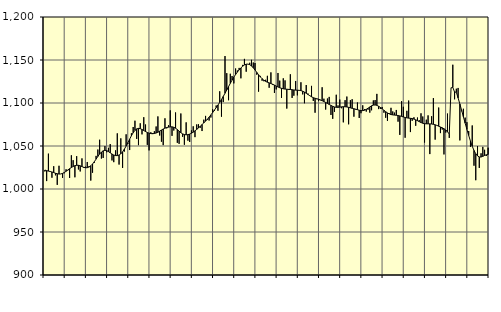
| Category | Piggar | Series 1 |
|---|---|---|
| nan | 1020.4 | 1022.06 |
| 1.0 | 1009.2 | 1021.32 |
| 1.0 | 1041.1 | 1020.83 |
| 1.0 | 1020.2 | 1020.38 |
| 1.0 | 1013.1 | 1019.77 |
| 1.0 | 1026.5 | 1019.11 |
| 1.0 | 1015.9 | 1018.29 |
| 1.0 | 1004.8 | 1017.75 |
| 1.0 | 1027 | 1017.39 |
| 1.0 | 1017.5 | 1017.51 |
| 1.0 | 1012.9 | 1018.12 |
| 1.0 | 1018.3 | 1019.17 |
| nan | 1022.9 | 1020.57 |
| 2.0 | 1021.6 | 1022.12 |
| 2.0 | 1012.8 | 1023.63 |
| 2.0 | 1039.2 | 1024.98 |
| 2.0 | 1033.5 | 1026.19 |
| 2.0 | 1013.6 | 1027.11 |
| 2.0 | 1038.2 | 1027.57 |
| 2.0 | 1022.7 | 1027.54 |
| 2.0 | 1020.4 | 1026.97 |
| 2.0 | 1035.6 | 1026.07 |
| 2.0 | 1024.5 | 1025.22 |
| 2.0 | 1026 | 1024.72 |
| nan | 1031.4 | 1024.78 |
| 3.0 | 1026.6 | 1025.52 |
| 3.0 | 1009.8 | 1026.97 |
| 3.0 | 1018.9 | 1029.09 |
| 3.0 | 1030.4 | 1031.74 |
| 3.0 | 1038.5 | 1034.75 |
| 3.0 | 1045.9 | 1037.85 |
| 3.0 | 1057.3 | 1040.69 |
| 3.0 | 1035.4 | 1042.93 |
| 3.0 | 1036.1 | 1044.4 |
| 3.0 | 1049.9 | 1044.96 |
| 3.0 | 1042.7 | 1044.61 |
| nan | 1047.9 | 1043.51 |
| 4.0 | 1052.2 | 1042.06 |
| 4.0 | 1033.2 | 1040.64 |
| 4.0 | 1031.2 | 1039.55 |
| 4.0 | 1044.9 | 1038.87 |
| 4.0 | 1064.7 | 1038.8 |
| 4.0 | 1028.4 | 1039.47 |
| 4.0 | 1058.9 | 1040.91 |
| 4.0 | 1024.5 | 1043.22 |
| 4.0 | 1043.5 | 1046.31 |
| 4.0 | 1063.6 | 1049.93 |
| 4.0 | 1052.3 | 1053.86 |
| nan | 1045.3 | 1057.98 |
| 5.0 | 1064.8 | 1061.93 |
| 5.0 | 1072.1 | 1065.41 |
| 5.0 | 1079.4 | 1068.15 |
| 5.0 | 1058.2 | 1069.9 |
| 5.0 | 1051 | 1070.49 |
| 5.0 | 1076.4 | 1070.14 |
| 5.0 | 1063.5 | 1069.18 |
| 5.0 | 1083.5 | 1067.98 |
| 5.0 | 1075 | 1066.82 |
| 5.0 | 1051.3 | 1065.77 |
| 5.0 | 1044.9 | 1064.94 |
| nan | 1066 | 1064.41 |
| 6.0 | 1065.1 | 1064.29 |
| 6.0 | 1067.2 | 1064.55 |
| 6.0 | 1072.7 | 1065.09 |
| 6.0 | 1084.4 | 1065.98 |
| 6.0 | 1062.2 | 1067.25 |
| 6.0 | 1055 | 1068.56 |
| 6.0 | 1051 | 1069.75 |
| 6.0 | 1082.2 | 1070.77 |
| 6.0 | 1070.5 | 1071.48 |
| 6.0 | 1074.2 | 1071.95 |
| 6.0 | 1091.4 | 1072.27 |
| nan | 1061.8 | 1072.28 |
| 7.0 | 1068 | 1071.75 |
| 7.0 | 1089 | 1070.7 |
| 7.0 | 1053.7 | 1069.16 |
| 7.0 | 1052.5 | 1067.31 |
| 7.0 | 1087.8 | 1065.48 |
| 7.0 | 1060.7 | 1064.09 |
| 7.0 | 1051.4 | 1063.3 |
| 7.0 | 1077.5 | 1063.04 |
| 7.0 | 1056.2 | 1063.22 |
| 7.0 | 1054.7 | 1063.84 |
| 7.0 | 1068.2 | 1064.83 |
| nan | 1072.9 | 1066.09 |
| 8.0 | 1060.3 | 1067.63 |
| 8.0 | 1075.1 | 1069.3 |
| 8.0 | 1075.2 | 1071.08 |
| 8.0 | 1071.2 | 1072.98 |
| 8.0 | 1067.4 | 1074.9 |
| 8.0 | 1080.6 | 1076.84 |
| 8.0 | 1085 | 1078.91 |
| 8.0 | 1080.2 | 1081.12 |
| 8.0 | 1079.6 | 1083.54 |
| 8.0 | 1083.1 | 1086.17 |
| 8.0 | 1092.7 | 1088.92 |
| nan | 1090.7 | 1091.75 |
| 9.0 | 1097.1 | 1094.65 |
| 9.0 | 1091 | 1097.65 |
| 9.0 | 1113.6 | 1100.73 |
| 9.0 | 1084.1 | 1104.05 |
| 9.0 | 1101.1 | 1107.62 |
| 9.0 | 1154.6 | 1111.34 |
| 9.0 | 1134.7 | 1115.16 |
| 9.0 | 1103.2 | 1119.02 |
| 9.0 | 1134 | 1122.87 |
| 9.0 | 1131.4 | 1126.59 |
| 9.0 | 1122.8 | 1130.04 |
| nan | 1140.1 | 1133.14 |
| 10.0 | 1137.8 | 1135.93 |
| 10.0 | 1140.8 | 1138.5 |
| 10.0 | 1128.7 | 1140.82 |
| 10.0 | 1144.3 | 1142.76 |
| 10.0 | 1151.3 | 1144.25 |
| 10.0 | 1136.4 | 1145.13 |
| 10.0 | 1145.3 | 1145.23 |
| 10.0 | 1146.8 | 1144.57 |
| 10.0 | 1150.2 | 1143.13 |
| 10.0 | 1147.1 | 1140.95 |
| 10.0 | 1146.5 | 1138.34 |
| nan | 1132.9 | 1135.58 |
| 11.0 | 1113.2 | 1132.86 |
| 11.0 | 1131.5 | 1130.35 |
| 11.0 | 1125.9 | 1128.26 |
| 11.0 | 1125.3 | 1126.58 |
| 11.0 | 1127 | 1125.19 |
| 11.0 | 1131.6 | 1124.16 |
| 11.0 | 1117.7 | 1123.41 |
| 11.0 | 1135.6 | 1122.65 |
| 11.0 | 1120.9 | 1121.78 |
| 11.0 | 1111.7 | 1120.8 |
| 11.0 | 1115.8 | 1119.69 |
| nan | 1134.9 | 1118.62 |
| 12.0 | 1126 | 1117.73 |
| 12.0 | 1105.9 | 1117.05 |
| 12.0 | 1128.7 | 1116.51 |
| 12.0 | 1126.3 | 1116.2 |
| 12.0 | 1093.5 | 1116.01 |
| 12.0 | 1115.3 | 1115.86 |
| 12.0 | 1133.4 | 1115.69 |
| 12.0 | 1105.9 | 1115.45 |
| 12.0 | 1108.5 | 1115.15 |
| 12.0 | 1125.6 | 1114.97 |
| 12.0 | 1108.9 | 1114.87 |
| nan | 1114.9 | 1114.73 |
| 13.0 | 1124.1 | 1114.4 |
| 13.0 | 1110 | 1113.71 |
| 13.0 | 1099.7 | 1112.65 |
| 13.0 | 1120.9 | 1111.32 |
| 13.0 | 1111 | 1109.91 |
| 13.0 | 1108.1 | 1108.53 |
| 13.0 | 1119.9 | 1107.23 |
| 13.0 | 1102.4 | 1106.19 |
| 13.0 | 1088.7 | 1105.51 |
| 13.0 | 1104.4 | 1104.96 |
| 13.0 | 1102.2 | 1104.36 |
| nan | 1103.2 | 1103.62 |
| 14.0 | 1118.3 | 1102.69 |
| 14.0 | 1105 | 1101.68 |
| 14.0 | 1092.4 | 1100.64 |
| 14.0 | 1105.2 | 1099.49 |
| 14.0 | 1107.1 | 1098.31 |
| 14.0 | 1086.1 | 1097.17 |
| 14.0 | 1081.6 | 1096.13 |
| 14.0 | 1089.7 | 1095.35 |
| 14.0 | 1109.6 | 1094.98 |
| 14.0 | 1097.2 | 1094.97 |
| 14.0 | 1104 | 1095.18 |
| nan | 1093.9 | 1095.49 |
| 15.0 | 1077.5 | 1095.68 |
| 15.0 | 1103.3 | 1095.63 |
| 15.0 | 1107.5 | 1095.39 |
| 15.0 | 1075.2 | 1094.96 |
| 15.0 | 1103.3 | 1094.4 |
| 15.0 | 1104.4 | 1093.83 |
| 15.0 | 1084.1 | 1093.33 |
| 15.0 | 1092.3 | 1092.83 |
| 15.0 | 1100.6 | 1092.21 |
| 15.0 | 1082.6 | 1091.57 |
| 15.0 | 1088.1 | 1091.16 |
| nan | 1097.3 | 1091.13 |
| 16.0 | 1092.9 | 1091.63 |
| 16.0 | 1090 | 1092.64 |
| 16.0 | 1092.2 | 1093.97 |
| 16.0 | 1088.8 | 1095.42 |
| 16.0 | 1091.5 | 1096.74 |
| 16.0 | 1103 | 1097.54 |
| 16.0 | 1103.4 | 1097.71 |
| 16.0 | 1110.6 | 1097.24 |
| 16.0 | 1092.9 | 1096.2 |
| 16.0 | 1093.1 | 1094.84 |
| 16.0 | 1095.4 | 1093.27 |
| nan | 1088.7 | 1091.52 |
| 17.0 | 1082.8 | 1089.87 |
| 17.0 | 1079.2 | 1088.48 |
| 17.0 | 1088.2 | 1087.35 |
| 17.0 | 1094.4 | 1086.59 |
| 17.0 | 1090.2 | 1086.17 |
| 17.0 | 1088.8 | 1085.94 |
| 17.0 | 1091.9 | 1085.73 |
| 17.0 | 1078.3 | 1085.44 |
| 17.0 | 1062.9 | 1085.01 |
| 17.0 | 1102.1 | 1084.45 |
| 17.0 | 1095.6 | 1083.77 |
| nan | 1059.6 | 1083.17 |
| 18.0 | 1090.9 | 1082.73 |
| 18.0 | 1102.8 | 1082.38 |
| 18.0 | 1066.2 | 1082.18 |
| 18.0 | 1079.3 | 1081.91 |
| 18.0 | 1083.4 | 1081.31 |
| 18.0 | 1073.5 | 1080.44 |
| 18.0 | 1083.1 | 1079.43 |
| 18.0 | 1080.1 | 1078.32 |
| 18.0 | 1088 | 1077.3 |
| 18.0 | 1084.3 | 1076.47 |
| 18.0 | 1054 | 1075.93 |
| nan | 1080.6 | 1075.77 |
| 19.0 | 1085.6 | 1075.79 |
| 19.0 | 1040.6 | 1075.74 |
| 19.0 | 1084.6 | 1075.57 |
| 19.0 | 1105.7 | 1075.22 |
| 19.0 | 1057.4 | 1074.67 |
| 19.0 | 1074 | 1073.93 |
| 19.0 | 1094.7 | 1073.02 |
| 19.0 | 1065 | 1072.1 |
| 19.0 | 1069.1 | 1071.17 |
| 19.0 | 1040.2 | 1070.05 |
| 19.0 | 1065.6 | 1068.6 |
| nan | 1087.7 | 1066.62 |
| 20.0 | 1059.4 | 1063.87 |
| 20.0 | 1117.4 | 1117.58 |
| 20.0 | 1144.5 | 1118.2 |
| 20.0 | 1104.3 | 1112.76 |
| 20.0 | 1116.6 | 1112.51 |
| 20.0 | 1117.5 | 1105.89 |
| 20.0 | 1056.5 | 1098.83 |
| 20.0 | 1090.4 | 1091.45 |
| 20.0 | 1093.3 | 1083.97 |
| 20.0 | 1083 | 1076.54 |
| 20.0 | 1077.7 | 1069.3 |
| nan | 1067.4 | 1062.26 |
| 21.0 | 1049 | 1055.64 |
| 21.0 | 1073.9 | 1049.78 |
| 21.0 | 1027.1 | 1044.85 |
| 21.0 | 1010.2 | 1041.02 |
| 21.0 | 1049.9 | 1038.51 |
| 21.0 | 1024.5 | 1037.26 |
| 21.0 | 1041.5 | 1037.18 |
| 21.0 | 1049 | 1037.98 |
| 21.0 | 1045.6 | 1038.99 |
| 21.0 | 1038.4 | 1039.8 |
| 21.0 | 1048 | 1040.11 |